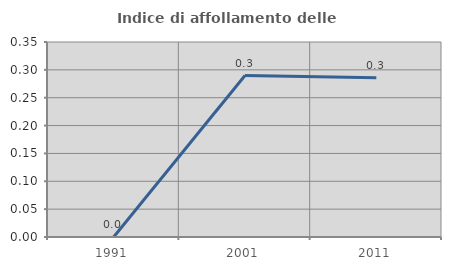
| Category | Indice di affollamento delle abitazioni  |
|---|---|
| 1991.0 | 0 |
| 2001.0 | 0.29 |
| 2011.0 | 0.286 |